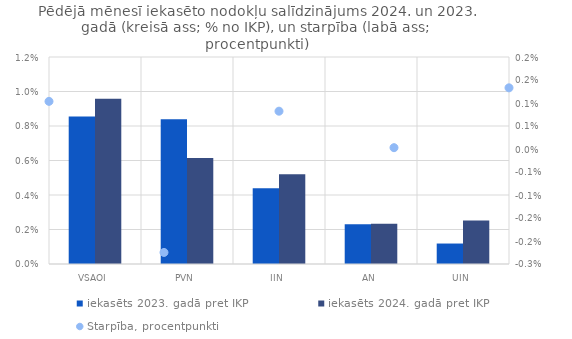
| Category | iekasēts 2023. gadā pret IKP | iekasēts 2024. gadā pret IKP |
|---|---|---|
| VSAOI | 0.009 | 0.01 |
| PVN | 0.008 | 0.006 |
| IIN | 0.004 | 0.005 |
| AN | 0.002 | 0.002 |
| UIN | 0.001 | 0.003 |